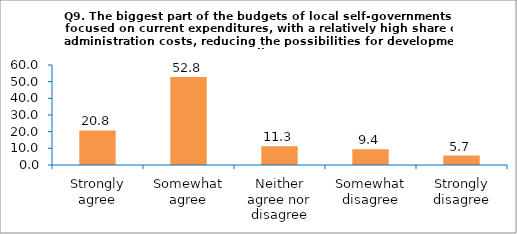
| Category | Series 0 |
|---|---|
| Strongly agree | 20.755 |
| Somewhat agree | 52.83 |
| Neither agree nor disagree | 11.321 |
| Somewhat disagree | 9.434 |
| Strongly disagree | 5.66 |